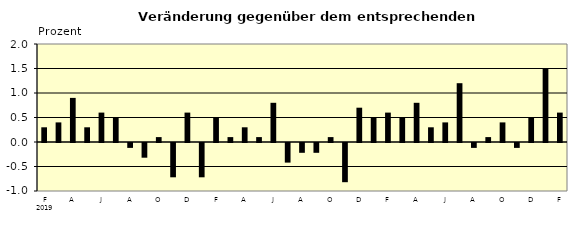
| Category | Series 0 |
|---|---|
| 0 | 0.3 |
| 1 | 0.4 |
| 2 | 0.9 |
| 3 | 0.3 |
| 4 | 0.6 |
| 5 | 0.5 |
| 6 | -0.1 |
| 7 | -0.3 |
| 8 | 0.1 |
| 9 | -0.7 |
| 10 | 0.6 |
| 11 | -0.7 |
| 12 | 0.5 |
| 13 | 0.1 |
| 14 | 0.3 |
| 15 | 0.1 |
| 16 | 0.8 |
| 17 | -0.4 |
| 18 | -0.2 |
| 19 | -0.2 |
| 20 | 0.1 |
| 21 | -0.8 |
| 22 | 0.7 |
| 23 | 0.5 |
| 24 | 0.6 |
| 25 | 0.5 |
| 26 | 0.8 |
| 27 | 0.3 |
| 28 | 0.4 |
| 29 | 1.2 |
| 30 | -0.1 |
| 31 | 0.1 |
| 32 | 0.4 |
| 33 | -0.1 |
| 34 | 0.5 |
| 35 | 1.5 |
| 36 | 0.6 |